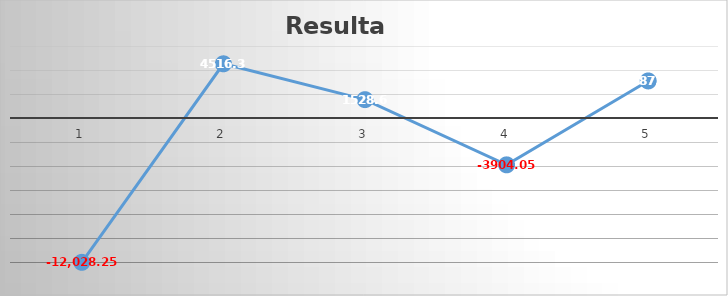
| Category | Series 0 |
|---|---|
| 0 | -12028.25 |
| 1 | 4516.35 |
| 2 | 1528.6 |
| 3 | -3904.05 |
| 4 | 3087.1 |